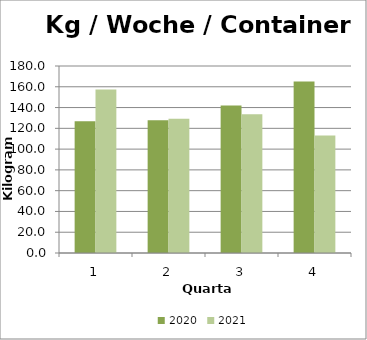
| Category | 2020 | 2021 |
|---|---|---|
| 0 | 126.923 | 157.308 |
| 1 | 127.692 | 129.231 |
| 2 | 141.923 | 133.462 |
| 3 | 165 | 113.077 |